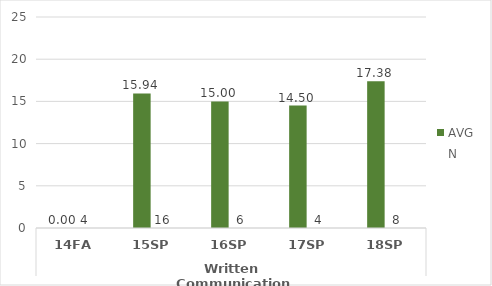
| Category | Human Services - AVG | Human Services - N |
|---|---|---|
| 0 | 0 | 4 |
| 1 | 15.938 | 16 |
| 2 | 15 | 6 |
| 3 | 14.5 | 4 |
| 4 | 17.375 | 8 |